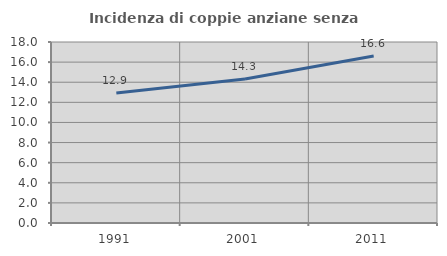
| Category | Incidenza di coppie anziane senza figli  |
|---|---|
| 1991.0 | 12.939 |
| 2001.0 | 14.319 |
| 2011.0 | 16.605 |